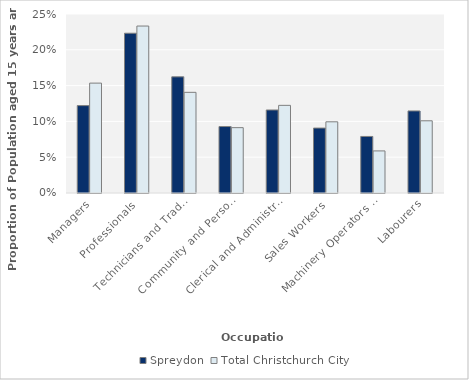
| Category | Spreydon | Total Christchurch City |
|---|---|---|
| Managers | 0.122 | 0.153 |
| Professionals | 0.223 | 0.233 |
| Technicians and Trades Workers | 0.162 | 0.141 |
| Community and Personal Service Workers | 0.093 | 0.091 |
| Clerical and Administrative Workers | 0.116 | 0.122 |
| Sales Workers | 0.091 | 0.099 |
| Machinery Operators and Drivers | 0.079 | 0.059 |
| Labourers | 0.115 | 0.101 |